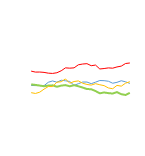
| Category | East | North | South | West |
|---|---|---|---|---|
| 0 | 4392 | 4494 | 5744 | 3711 |
| 1 | 4377 | 4443 | 5652 | 3636 |
| 2 | 4381 | 4382 | 5657 | 3756 |
| 3 | 4372 | 4318 | 5624 | 4044 |
| 4 | 4693 | 4377 | 5550 | 4289 |
| 5 | 4815 | 4402 | 5525 | 4286 |
| 6 | 4697 | 4270 | 5591 | 4701 |
| 7 | 4884 | 4374 | 5775 | 4743 |
| 8 | 4831 | 4424 | 6050 | 5007 |
| 9 | 4765 | 4314 | 6022 | 4601 |
| 10 | 4401 | 4416 | 6052 | 4763 |
| 11 | 4556 | 4319 | 6341 | 4820 |
| 12 | 4712 | 4192 | 6411 | 4602 |
| 13 | 4714 | 4053 | 6447 | 4487 |
| 14 | 4558 | 4035 | 6255 | 4424 |
| 15 | 4701 | 3863 | 6312 | 4558 |
| 16 | 4857 | 3650 | 5946 | 4458 |
| 17 | 4842 | 3731 | 5989 | 4373 |
| 18 | 4788 | 3666 | 6048 | 4156 |
| 19 | 4602 | 3630 | 6021 | 4083 |
| 20 | 4686 | 3764 | 6137 | 4397 |
| 21 | 4834 | 3567 | 6215 | 4326 |
| 22 | 4734 | 3492 | 6461 | 4606 |
| 23 | 4583 | 3694 | 6510 | 4745 |